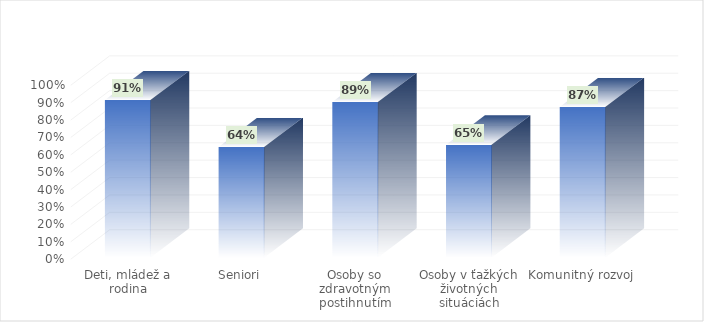
| Category | Podiel zrealizovaných aktivít |
|---|---|
| Deti, mládež a rodina | 0.906 |
| Seniori | 0.636 |
| Osoby so zdravotným postihnutím | 0.895 |
| Osoby v ťažkých životných situáciách | 0.65 |
| Komunitný rozvoj | 0.867 |